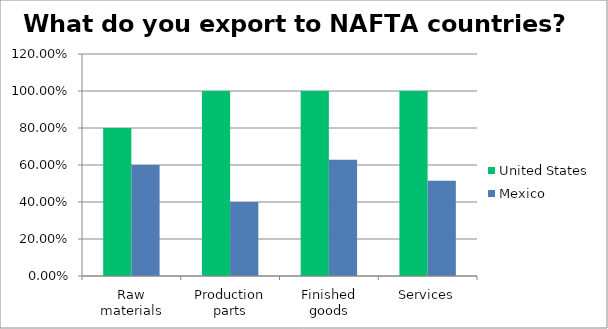
| Category | United States | Mexico |
|---|---|---|
| Raw materials | 0.8 | 0.6 |
| Production parts | 1 | 0.4 |
| Finished goods | 1 | 0.628 |
| Services | 1 | 0.515 |